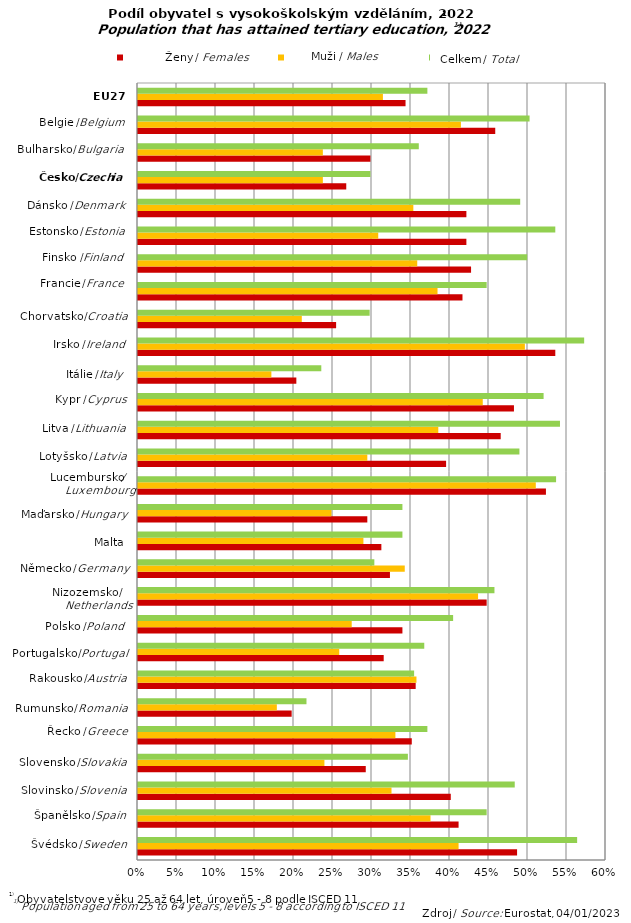
| Category | Celkem / Total | Muži / Males | Ženy / Females |
|---|---|---|---|
| Sweden | 0.486 | 0.411 | 0.563 |
| Spain | 0.411 | 0.375 | 0.447 |
| Slovenia | 0.401 | 0.325 | 0.483 |
| Slovakia | 0.292 | 0.239 | 0.346 |
| Greece | 0.351 | 0.33 | 0.371 |
| Romania | 0.197 | 0.178 | 0.216 |
| Austria | 0.356 | 0.357 | 0.354 |
| Portugal | 0.315 | 0.258 | 0.367 |
| Poland | 0.339 | 0.274 | 0.404 |
| Netherlands | 0.447 | 0.436 | 0.457 |
| Germany | 0.323 | 0.342 | 0.303 |
| Malta | 0.312 | 0.289 | 0.339 |
| Hungary | 0.294 | 0.248 | 0.339 |
| Luxembourg | 0.523 | 0.51 | 0.536 |
| Latvia | 0.395 | 0.294 | 0.489 |
| Lithuania | 0.465 | 0.385 | 0.541 |
| Cyprus | 0.482 | 0.442 | 0.52 |
| Italy | 0.203 | 0.171 | 0.235 |
| Ireland | 0.535 | 0.496 | 0.572 |
| Croatia | 0.254 | 0.21 | 0.297 |
| France | 0.416 | 0.384 | 0.447 |
| Finland | 0.427 | 0.358 | 0.499 |
| Estonia | 0.421 | 0.308 | 0.535 |
| Denmark | 0.421 | 0.353 | 0.49 |
| Czechia | 0.267 | 0.237 | 0.298 |
| Bulgaria | 0.298 | 0.237 | 0.36 |
| Belgium | 0.458 | 0.414 | 0.502 |
| EU 27 | 0.343 | 0.314 | 0.371 |